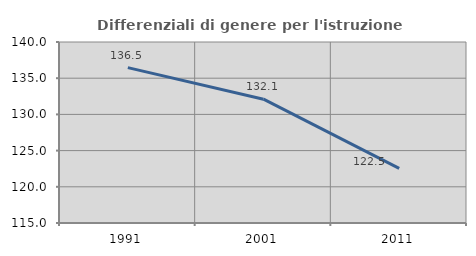
| Category | Differenziali di genere per l'istruzione superiore |
|---|---|
| 1991.0 | 136.462 |
| 2001.0 | 132.102 |
| 2011.0 | 122.548 |